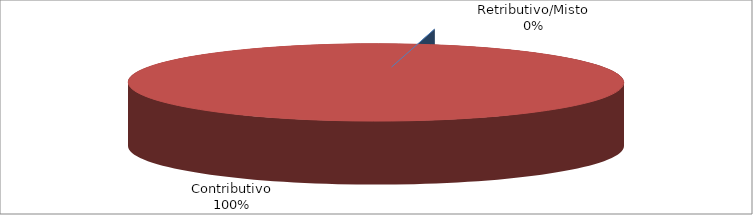
| Category | Decorrenti ANNO 2022 |
|---|---|
| Retributivo/Misto | 0 |
| Contributivo | 41431 |